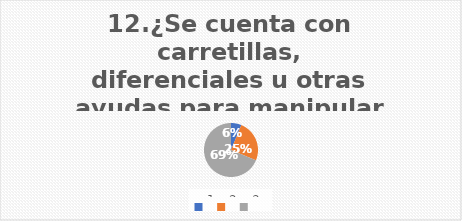
| Category | ¿Se cuenta con carretillas, diferenciales u otras ayudas para manipular
objetos pesados?  |
|---|---|
| 0 | 6.25 |
| 1 | 25 |
| 2 | 68.75 |